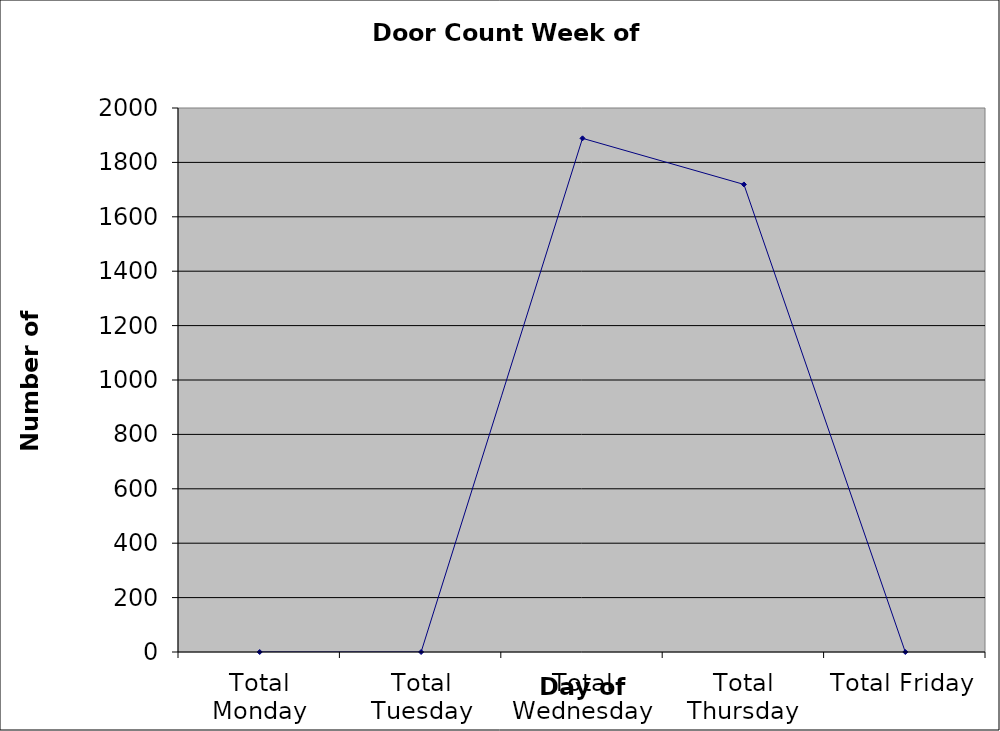
| Category | Series 0 |
|---|---|
| Total Monday | 0 |
| Total Tuesday | 0 |
| Total Wednesday | 1888.5 |
| Total Thursday | 1719 |
| Total Friday | 0 |